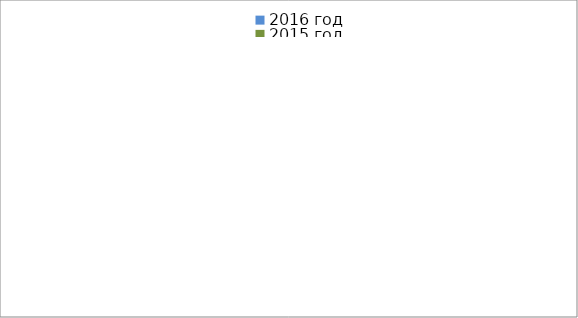
| Category | 2016 год | 2015 год |
|---|---|---|
|  - поджог | 9 | 2 |
|  - неосторожное обращение с огнём | 9 | 10 |
|  - НПТЭ электрооборудования | 3 | 2 |
|  - НПУ и Э печей | 13 | 10 |
|  - НПУ и Э транспортных средств | 5 | 19 |
|   -Шалость с огнем детей | 1 | 0 |
|  -НППБ при эксплуатации эл.приборов | 0 | 5 |
|  - курение | 0 | 2 |
| - прочие | 13 | 18 |
| - не установленные причины | 4 | 1 |